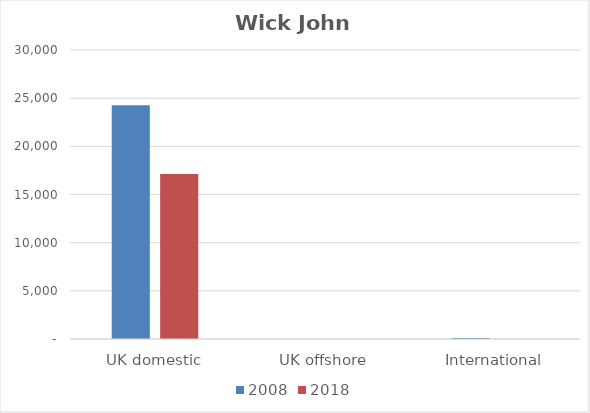
| Category | 2008 | 2018 |
|---|---|---|
| UK domestic | 24264 | 17116 |
| UK offshore | 1 | 0 |
| International | 114 | 0 |